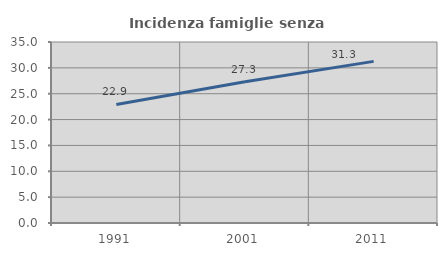
| Category | Incidenza famiglie senza nuclei |
|---|---|
| 1991.0 | 22.927 |
| 2001.0 | 27.304 |
| 2011.0 | 31.252 |